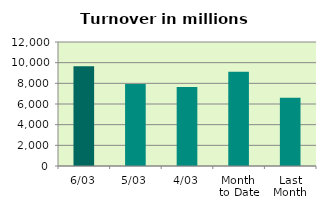
| Category | Series 0 |
|---|---|
| 6/03 | 9659.114 |
| 5/03 | 7942.959 |
| 4/03 | 7650.55 |
| Month 
to Date | 9123.866 |
| Last
Month | 6605.047 |